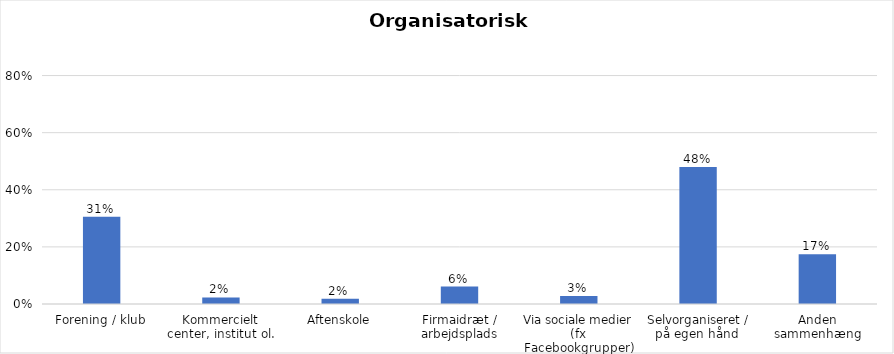
| Category | % |
|---|---|
| Forening / klub | 0.306 |
| Kommercielt center, institut ol. | 0.023 |
| Aftenskole | 0.018 |
| Firmaidræt / arbejdsplads | 0.061 |
| Via sociale medier (fx Facebookgrupper) | 0.028 |
| Selvorganiseret / på egen hånd  | 0.479 |
| Anden sammenhæng | 0.175 |